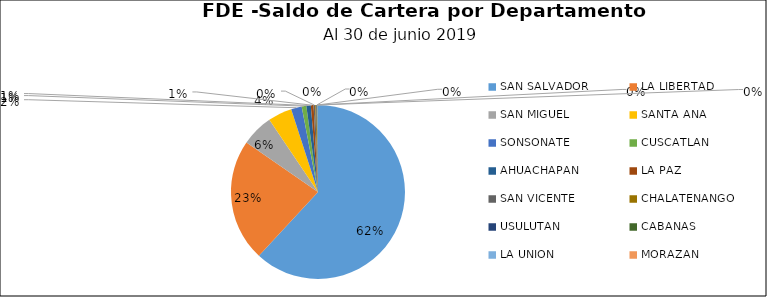
| Category | Saldo | Créditos |
|---|---|---|
| SAN SALVADOR | 30.484 | 398 |
| LA LIBERTAD | 11.205 | 148 |
| SAN MIGUEL | 2.921 | 23 |
| SANTA ANA | 2.195 | 25 |
| SONSONATE | 0.973 | 26 |
| CUSCATLAN | 0.426 | 25 |
| AHUACHAPAN | 0.407 | 13 |
| LA PAZ | 0.249 | 13 |
| SAN VICENTE | 0.151 | 3 |
| CHALATENANGO | 0.107 | 14 |
| USULUTAN | 0.066 | 12 |
| CABAÑAS | 0.041 | 10 |
| LA UNION | 0.034 | 4 |
| MORAZAN | 0.001 | 1 |